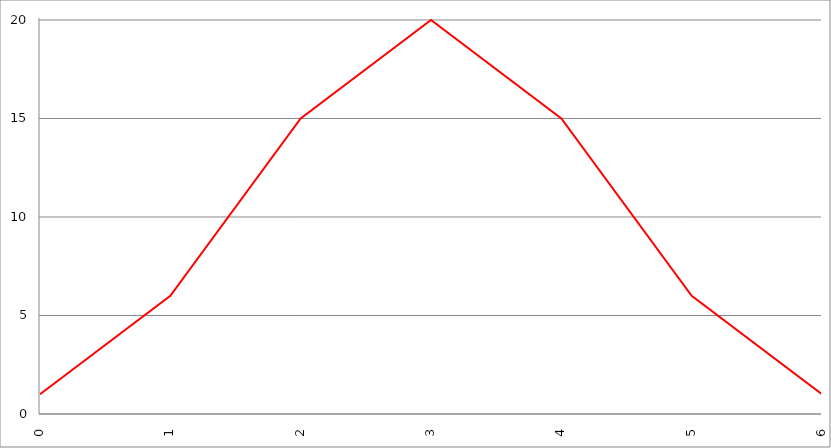
| Category | Series 1 |
|---|---|
| 0.0 | 1 |
| 1.0 | 6 |
| 2.0 | 15 |
| 3.0 | 20 |
| 4.0 | 15 |
| 5.0 | 6 |
| 6.0 | 1 |